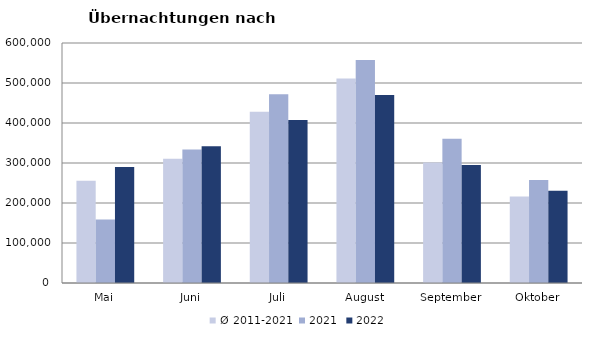
| Category | Ø 2011-2021 | 2021 | 2022 |
|---|---|---|---|
| Mai | 255705.636 | 158476 | 290079 |
| Juni | 310539.182 | 333648 | 341645 |
| Juli | 428074.636 | 472159 | 407558 |
| August | 510964.091 | 557336 | 470298 |
| September | 301237.455 | 360851 | 294755 |
| Oktober | 216113.909 | 257755 | 230442 |